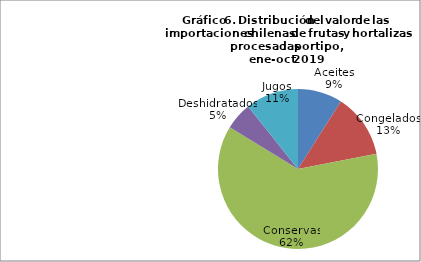
| Category | Series 0 |
|---|---|
| Aceites | 29621463.06 |
| Congelados | 42559797.16 |
| Conservas | 203404699.79 |
| Deshidratados | 18273613.75 |
| Jugos | 35234489.08 |